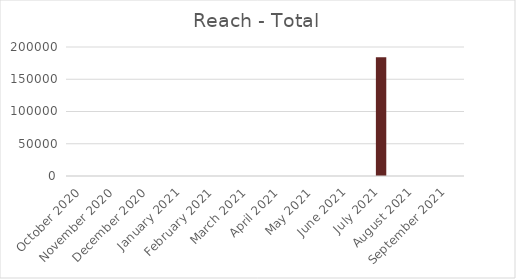
| Category | Total |
|---|---|
| October 2020 | 0 |
| November 2020 | 0 |
| December 2020 | 0 |
| January 2021 | 0 |
| February 2021 | 0 |
| March 2021 | 0 |
| April 2021 | 0 |
| May 2021 | 0 |
| June 2021 | 0 |
| July 2021 | 184254 |
| August 2021 | 0 |
| September 2021 | 0 |